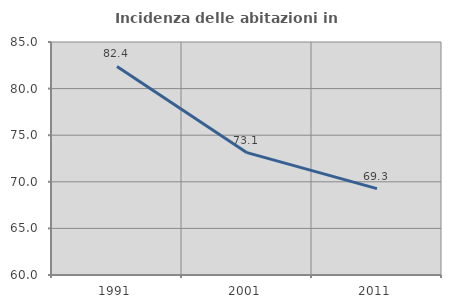
| Category | Incidenza delle abitazioni in proprietà  |
|---|---|
| 1991.0 | 82.378 |
| 2001.0 | 73.125 |
| 2011.0 | 69.265 |